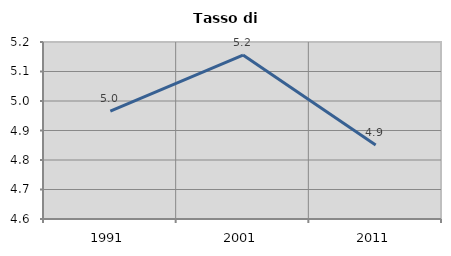
| Category | Tasso di disoccupazione   |
|---|---|
| 1991.0 | 4.966 |
| 2001.0 | 5.156 |
| 2011.0 | 4.851 |